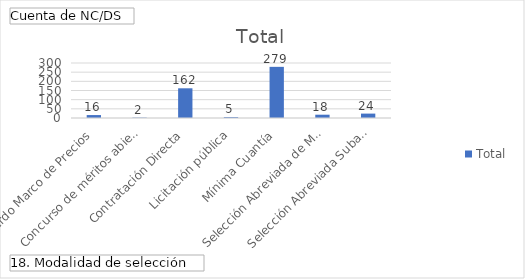
| Category | Total |
|---|---|
| Acuerdo Marco de Precios | 16 |
| Concurso de méritos abierto | 2 |
| Contratación Directa | 162 |
| Licitación pública | 5 |
| Mínima Cuantía | 279 |
| Selección Abreviada de Menor Cuantía | 18 |
| Selección Abreviada Subasta Inversa | 24 |